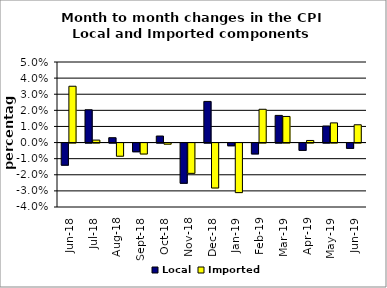
| Category | Local | Imported |
|---|---|---|
| 2018-06-01 | -0.014 | 0.035 |
| 2018-07-01 | 0.02 | 0.002 |
| 2018-08-01 | 0.003 | -0.008 |
| 2018-09-01 | -0.005 | -0.007 |
| 2018-10-01 | 0.004 | -0.001 |
| 2018-11-01 | -0.025 | -0.019 |
| 2018-12-01 | 0.026 | -0.028 |
| 2019-01-01 | -0.002 | -0.031 |
| 2019-02-01 | -0.007 | 0.021 |
| 2019-03-01 | 0.017 | 0.016 |
| 2019-04-01 | -0.005 | 0.001 |
| 2019-05-01 | 0.01 | 0.012 |
| 2019-06-01 | -0.003 | 0.011 |